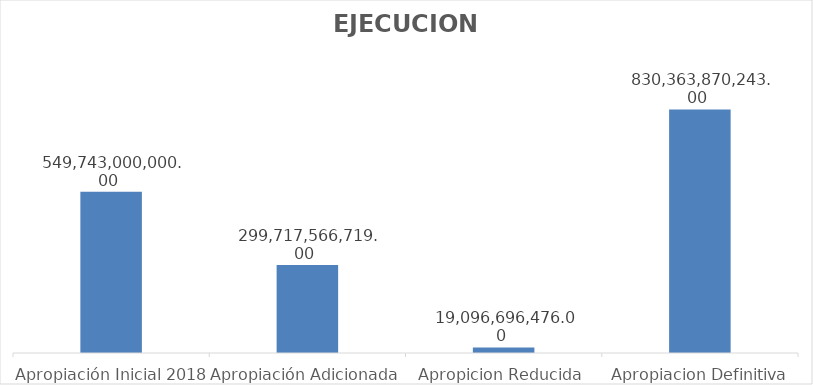
| Category | Series 0 |
|---|---|
| Apropiación Inicial 2018 | 549743000000 |
| Apropiación Adicionada | 299717566719 |
| Apropicion Reducida | 19096696476 |
| Apropiacion Definitiva 2018 | 830363870243 |